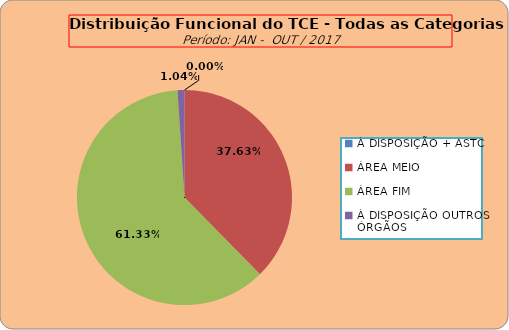
| Category | Series 0 |
|---|---|
| À DISPOSIÇÃO + ASTC | 0 |
| ÁREA MEIO | 181 |
| ÁREA FIM | 295 |
| À DISPOSIÇÃO OUTROS ÓRGÃOS | 5 |